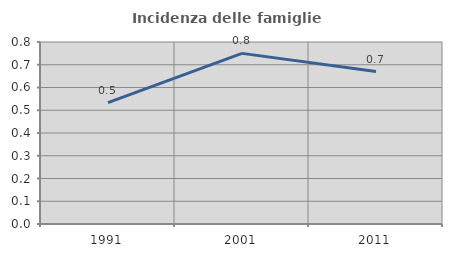
| Category | Incidenza delle famiglie numerose |
|---|---|
| 1991.0 | 0.533 |
| 2001.0 | 0.75 |
| 2011.0 | 0.67 |